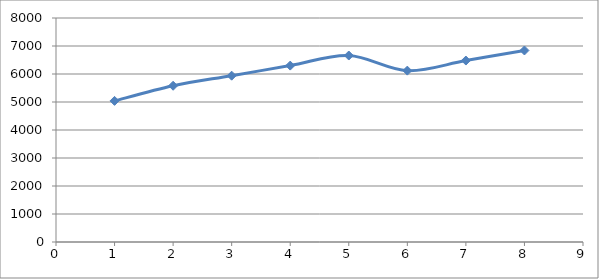
| Category | Series 0 |
|---|---|
| 1.0 | 5040 |
| 2.0 | 5580 |
| 3.0 | 5940 |
| 4.0 | 6300 |
| 5.0 | 6660 |
| 6.0 | 6120 |
| 7.0 | 6480 |
| 8.0 | 6840 |